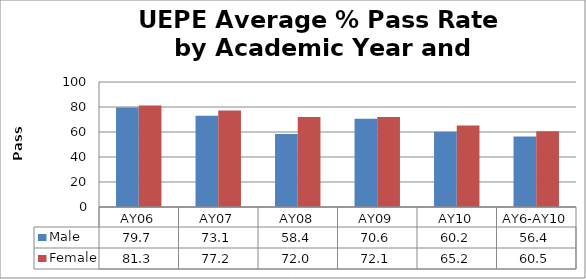
| Category | Male | Female |
|---|---|---|
| AY06 | 79.7 | 81.3 |
| AY07 | 73.1 | 77.2 |
| AY08 | 58.4 | 72 |
| AY09 | 70.6 | 72.1 |
| AY10 | 60.2 | 65.2 |
| AY6-AY10 | 56.36 | 60.52 |